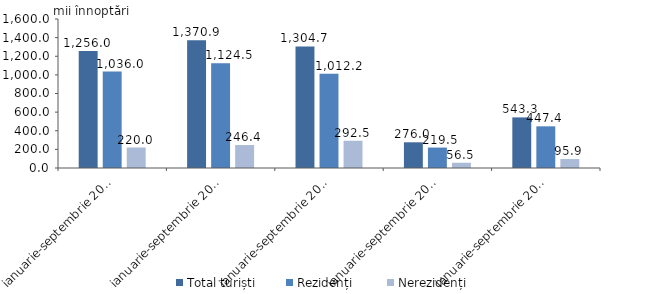
| Category | Total turiști | Rezidenți  | Nerezidenți |
|---|---|---|---|
| ianuarie-septembrie 2017 | 1256 | 1036 | 220 |
| ianuarie-septembrie 2018 | 1370.9 | 1124.5 | 246.4 |
| ianuarie-septembrie 2019 | 1304.7 | 1012.2 | 292.5 |
| ianuarie-septembrie 2020 | 276 | 219.5 | 56.5 |
| ianuarie-septembrie 2021 | 543.3 | 447.4 | 95.9 |